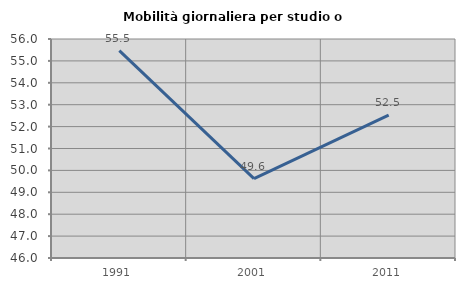
| Category | Mobilità giornaliera per studio o lavoro |
|---|---|
| 1991.0 | 55.469 |
| 2001.0 | 49.627 |
| 2011.0 | 52.528 |